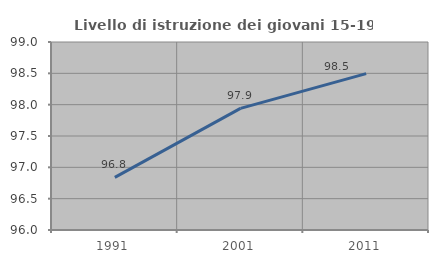
| Category | Livello di istruzione dei giovani 15-19 anni |
|---|---|
| 1991.0 | 96.839 |
| 2001.0 | 97.941 |
| 2011.0 | 98.495 |